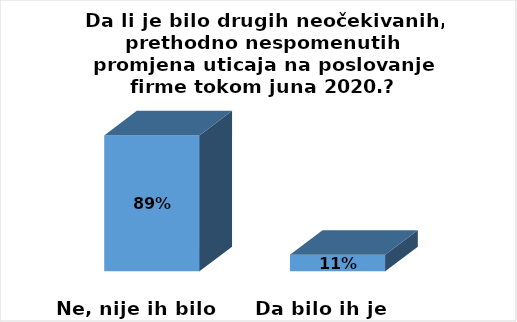
| Category | Series 0 |
|---|---|
| Ne, nije ih bilo | 305 |
| Da bilo ih je | 37 |